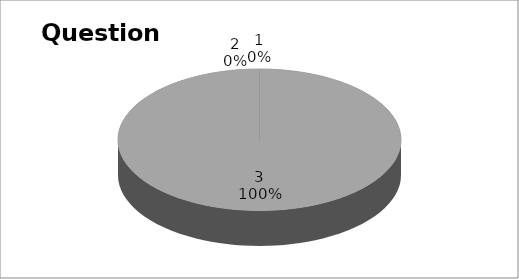
| Category | Series 0 |
|---|---|
| 0 | 0 |
| 1 | 0 |
| 2 | 10 |